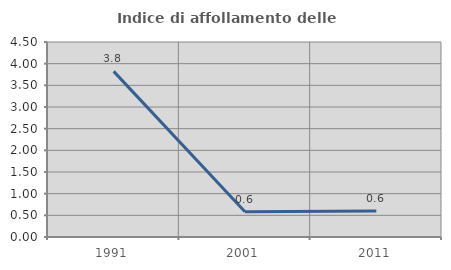
| Category | Indice di affollamento delle abitazioni  |
|---|---|
| 1991.0 | 3.822 |
| 2001.0 | 0.585 |
| 2011.0 | 0.599 |